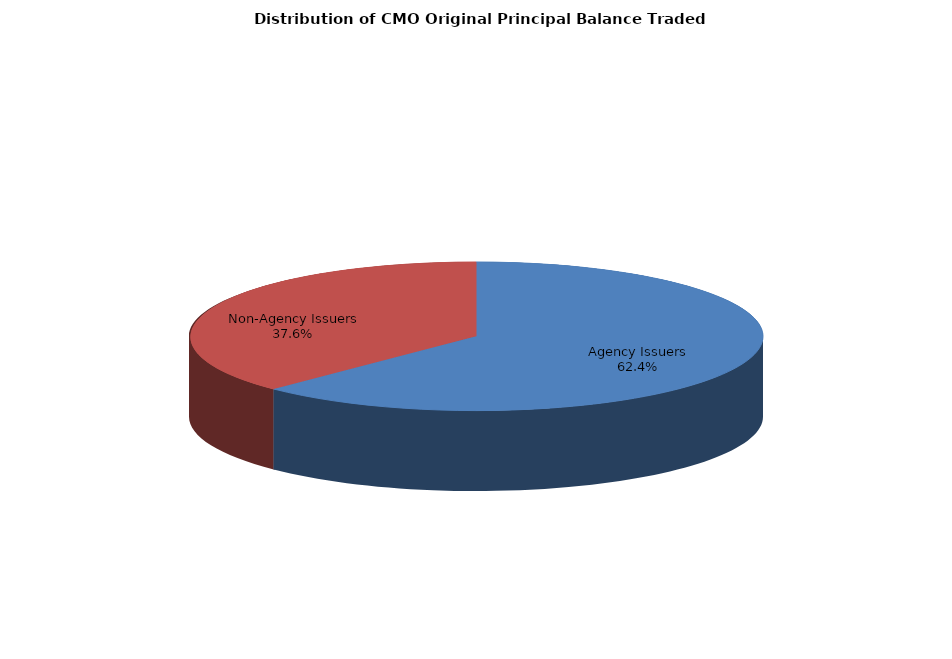
| Category | Series 0 |
|---|---|
| Agency Issuers | 5799594657.949 |
| Non-Agency Issuers | 3487190785.738 |